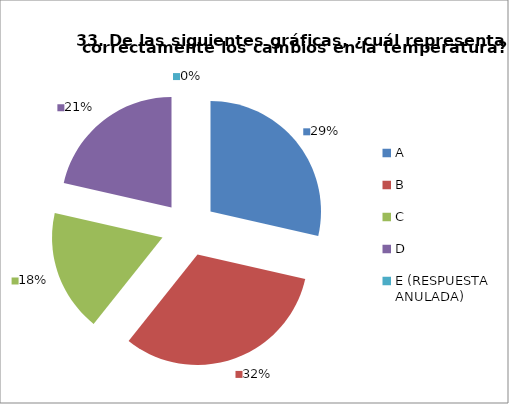
| Category | CANTIDAD DE RESPUESTAS PREGUNTA (33) | PORCENTAJE |
|---|---|---|
| A | 8 | 0.286 |
| B | 9 | 0.321 |
| C | 5 | 0.179 |
| D | 6 | 0.214 |
| E (RESPUESTA ANULADA) | 0 | 0 |